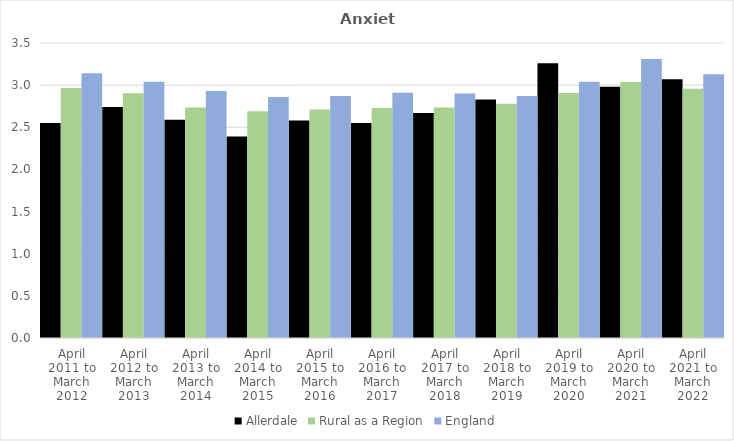
| Category | Allerdale | Rural as a Region | England |
|---|---|---|---|
| April 2011 to March 2012 | 2.55 | 2.967 | 3.14 |
| April 2012 to March 2013 | 2.74 | 2.904 | 3.04 |
| April 2013 to March 2014 | 2.59 | 2.734 | 2.93 |
| April 2014 to March 2015 | 2.39 | 2.691 | 2.86 |
| April 2015 to March 2016 | 2.58 | 2.711 | 2.87 |
| April 2016 to March 2017 | 2.55 | 2.729 | 2.91 |
| April 2017 to March 2018 | 2.67 | 2.736 | 2.9 |
| April 2018 to March 2019 | 2.83 | 2.78 | 2.87 |
| April 2019 to March 2020 | 3.26 | 2.908 | 3.04 |
| April 2020 to March 2021 | 2.98 | 3.036 | 3.31 |
| April 2021 to March 2022 | 3.07 | 2.956 | 3.13 |